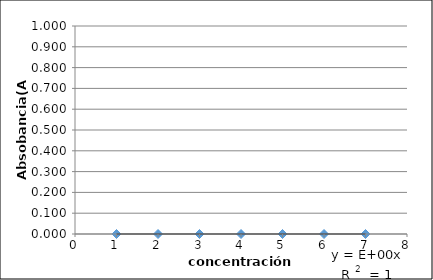
| Category | Absorbancia (A) |
|---|---|
| 0.0 | 0 |
| 0.0 | 0 |
| 0.0 | 0 |
| 0.0 | 0 |
| 0.0 | 0 |
| 0.0 | 0 |
| 0.0 | 0 |